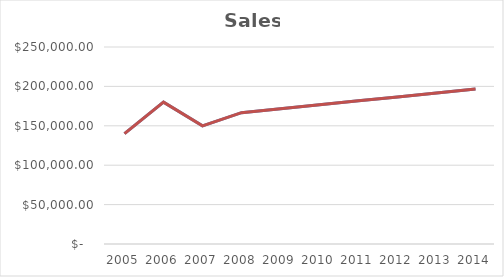
| Category | Sales |
|---|---|
| 2005.0 | 140000 |
| 2006.0 | 180000 |
| 2007.0 | 150000 |
| 2008.0 | 166666.667 |
| 2009.0 | 171666.667 |
| 2010.0 | 176666.667 |
| 2011.0 | 181666.667 |
| 2012.0 | 186666.667 |
| 2013.0 | 191666.667 |
| 2014.0 | 196666.667 |